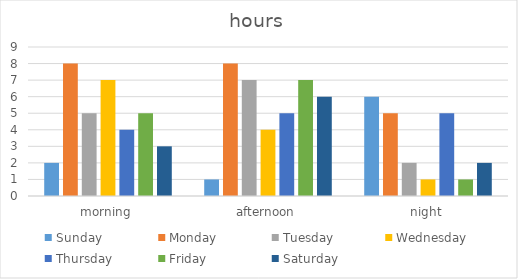
| Category | Sunday | Monday | Tuesday | Wednesday | Thursday | Friday | Saturday |
|---|---|---|---|---|---|---|---|
| morning | 2 | 8 | 5 | 7 | 4 | 5 | 3 |
| afternoon | 1 | 8 | 7 | 4 | 5 | 7 | 6 |
| night | 6 | 5 | 2 | 1 | 5 | 1 | 2 |